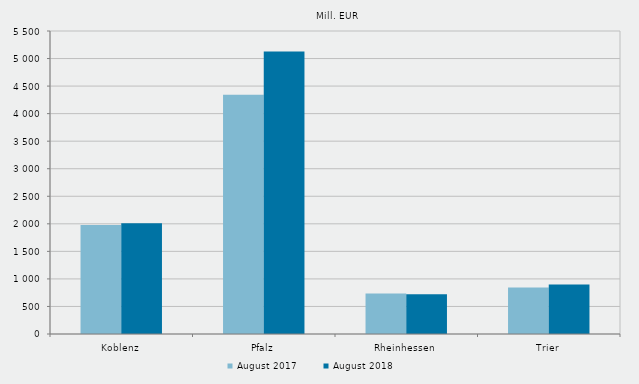
| Category | August 2017 | August 2018 |
|---|---|---|
| Koblenz | 1978.649 | 2011.647 |
| Pfalz | 4343.284 | 5126 |
| Rheinhessen | 733.833 | 720.009 |
| Trier | 842.604 | 900.438 |